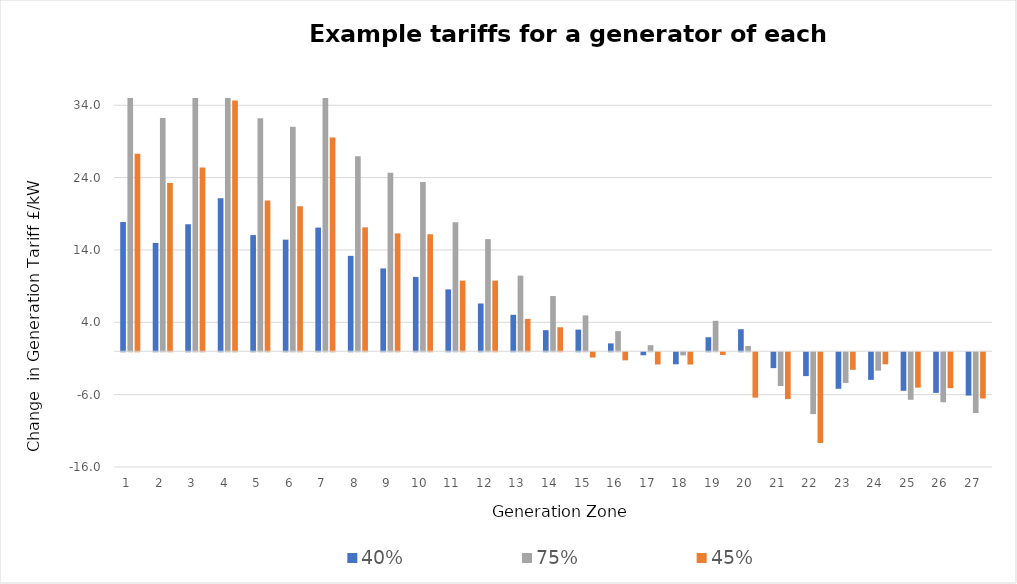
| Category | 40% | 75% | 45% |
|---|---|---|---|
| 1.0 | 17.854 | 38.265 | 27.286 |
| 2.0 | 14.97 | 32.247 | 23.256 |
| 3.0 | 17.539 | 36.686 | 25.393 |
| 4.0 | 21.139 | 45.838 | 34.647 |
| 5.0 | 16.053 | 32.185 | 20.821 |
| 6.0 | 15.425 | 31.043 | 20.024 |
| 7.0 | 17.087 | 38.297 | 29.55 |
| 8.0 | 13.184 | 26.938 | 17.123 |
| 9.0 | 11.445 | 24.654 | 16.285 |
| 10.0 | 10.274 | 23.404 | 16.169 |
| 11.0 | 8.551 | 17.833 | 9.755 |
| 12.0 | 6.603 | 15.497 | 9.762 |
| 13.0 | 5.038 | 10.449 | 4.468 |
| 14.0 | 2.91 | 7.627 | 3.312 |
| 15.0 | 2.987 | 4.955 | -0.731 |
| 16.0 | 1.084 | 2.774 | -1.122 |
| 17.0 | -0.419 | 0.831 | -1.69 |
| 18.0 | -1.669 | -0.428 | -1.702 |
| 19.0 | 1.936 | 4.207 | -0.375 |
| 20.0 | 3.046 | 0.73 | -6.275 |
| 21.0 | -2.197 | -4.67 | -6.477 |
| 22.0 | -3.3 | -8.555 | -12.539 |
| 23.0 | -5.052 | -4.242 | -2.431 |
| 24.0 | -3.818 | -2.549 | -1.666 |
| 25.0 | -5.331 | -6.574 | -4.895 |
| 26.0 | -5.62 | -6.92 | -4.967 |
| 27.0 | -5.986 | -8.396 | -6.395 |